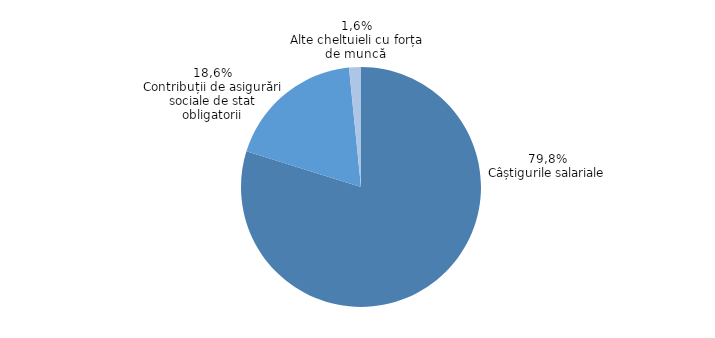
| Category | Series 0 |
|---|---|
| Câștigurile salariale | 79.8 |
| Contribuții de asigurări sociale de stat obligatorii | 18.6 |
| Alte cheltuieli cu forța de muncă  | 1.6 |